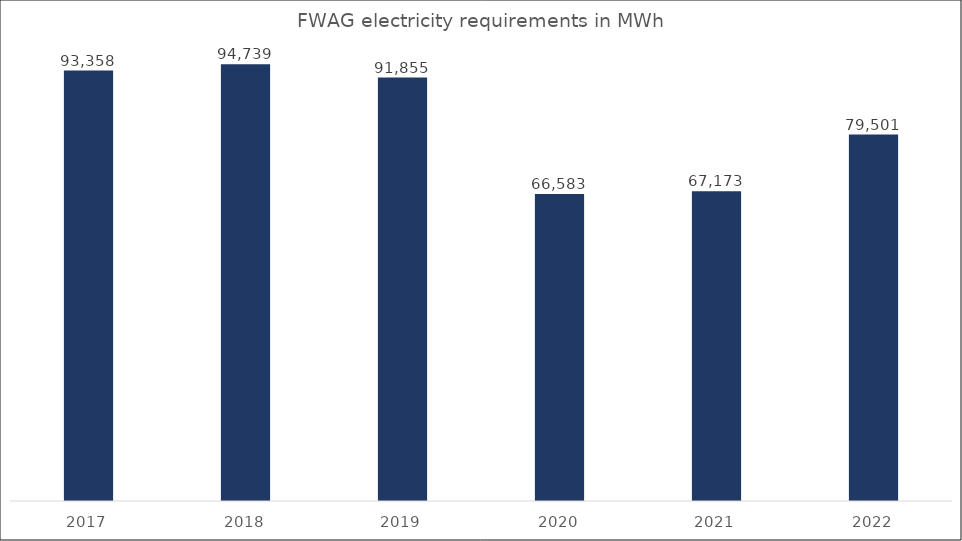
| Category | in MWh |
|---|---|
| 2017.0 | 93358 |
| 2018.0 | 94739.16 |
| 2019.0 | 91854.633 |
| 2020.0 | 66582.996 |
| 2021.0 | 67173.034 |
| 2022.0 | 79500.961 |